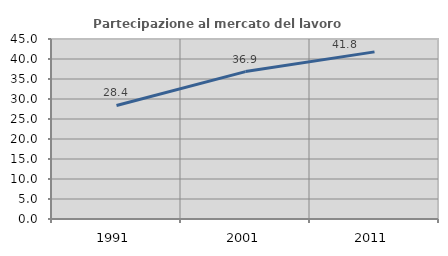
| Category | Partecipazione al mercato del lavoro  femminile |
|---|---|
| 1991.0 | 28.392 |
| 2001.0 | 36.853 |
| 2011.0 | 41.782 |